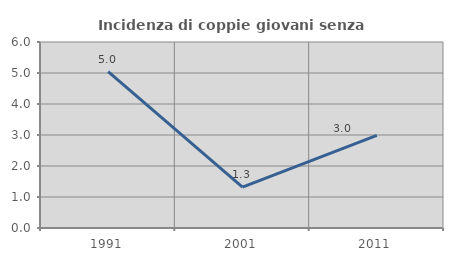
| Category | Incidenza di coppie giovani senza figli |
|---|---|
| 1991.0 | 5.042 |
| 2001.0 | 1.316 |
| 2011.0 | 2.985 |